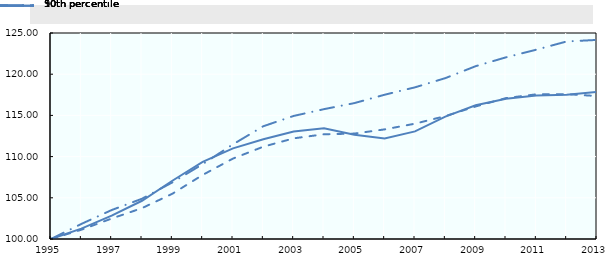
| Category | 10th percentile | 50th percentile | 90th percentile |
|---|---|---|---|
| 1995.0 | 100 | 100 | 100 |
| 1996.0 | 101.255 | 101.123 | 101.828 |
| 1997.0 | 102.837 | 102.484 | 103.514 |
| 1998.0 | 104.641 | 103.746 | 104.888 |
| 1999.0 | 107.066 | 105.489 | 106.866 |
| 2000.0 | 109.36 | 107.775 | 109.085 |
| 2001.0 | 111.004 | 109.762 | 111.487 |
| 2002.0 | 112.112 | 111.204 | 113.686 |
| 2003.0 | 113.034 | 112.215 | 114.935 |
| 2004.0 | 113.425 | 112.71 | 115.758 |
| 2005.0 | 112.653 | 112.792 | 116.492 |
| 2006.0 | 112.209 | 113.304 | 117.509 |
| 2007.0 | 113.062 | 113.995 | 118.407 |
| 2008.0 | 114.847 | 114.914 | 119.523 |
| 2009.0 | 116.237 | 116.086 | 120.972 |
| 2010.0 | 117.012 | 117.101 | 122.049 |
| 2011.0 | 117.428 | 117.56 | 122.977 |
| 2012.0 | 117.514 | 117.581 | 123.973 |
| 2013.0 | 117.853 | 117.348 | 124.162 |